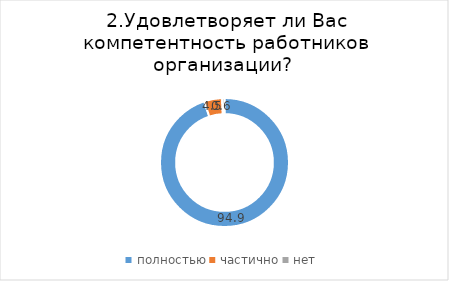
| Category | Series 0 |
|---|---|
| полностью | 94.914 |
| частично | 4.511 |
| нет | 0.576 |